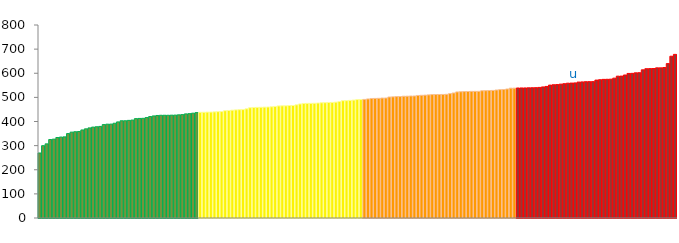
| Category | Top Quartile | 2nd Quartile | 3rd Quartile | Bottom Quartile | Series 4 |
|---|---|---|---|---|---|
|  | 269.4 | 0 | 0 | 0 | 269.4 |
|  | 299.8 | 0 | 0 | 0 | 299.8 |
|  | 307.3 | 0 | 0 | 0 | 307.3 |
|  | 325.2 | 0 | 0 | 0 | 325.2 |
|  | 326.9 | 0 | 0 | 0 | 326.9 |
|  | 333.6 | 0 | 0 | 0 | 333.6 |
|  | 335.5 | 0 | 0 | 0 | 335.5 |
|  | 336.3 | 0 | 0 | 0 | 336.3 |
|  | 350 | 0 | 0 | 0 | 350 |
|  | 355.9 | 0 | 0 | 0 | 355.9 |
|  | 357.6 | 0 | 0 | 0 | 357.6 |
|  | 358.4 | 0 | 0 | 0 | 358.4 |
|  | 364.9 | 0 | 0 | 0 | 364.9 |
|  | 369.6 | 0 | 0 | 0 | 369.6 |
|  | 373.4 | 0 | 0 | 0 | 373.4 |
|  | 376.8 | 0 | 0 | 0 | 376.8 |
|  | 378.2 | 0 | 0 | 0 | 378.2 |
|  | 379.6 | 0 | 0 | 0 | 379.6 |
|  | 387.2 | 0 | 0 | 0 | 387.2 |
|  | 388.9 | 0 | 0 | 0 | 388.9 |
|  | 389.2 | 0 | 0 | 0 | 389.2 |
|  | 392.7 | 0 | 0 | 0 | 392.7 |
|  | 398.3 | 0 | 0 | 0 | 398.3 |
|  | 403 | 0 | 0 | 0 | 403 |
|  | 403.1 | 0 | 0 | 0 | 403.1 |
|  | 404.6 | 0 | 0 | 0 | 404.6 |
|  | 405.9 | 0 | 0 | 0 | 405.9 |
|  | 411.9 | 0 | 0 | 0 | 411.9 |
|  | 412.7 | 0 | 0 | 0 | 412.7 |
|  | 413.2 | 0 | 0 | 0 | 413.2 |
|  | 416.3 | 0 | 0 | 0 | 416.3 |
|  | 420.5 | 0 | 0 | 0 | 420.5 |
|  | 423.1 | 0 | 0 | 0 | 423.1 |
|  | 425 | 0 | 0 | 0 | 425 |
|  | 425.8 | 0 | 0 | 0 | 425.8 |
|  | 425.8 | 0 | 0 | 0 | 425.8 |
|  | 425.8 | 0 | 0 | 0 | 425.8 |
|  | 426.2 | 0 | 0 | 0 | 426.2 |
|  | 426.5 | 0 | 0 | 0 | 426.5 |
|  | 427.6 | 0 | 0 | 0 | 427.6 |
|  | 428.5 | 0 | 0 | 0 | 428.5 |
|  | 431.5 | 0 | 0 | 0 | 431.5 |
|  | 432.5 | 0 | 0 | 0 | 432.5 |
|  | 434.5 | 0 | 0 | 0 | 434.5 |
|  | 436.8 | 0 | 0 | 0 | 436.8 |
|  | 0 | 438.3 | 0 | 0 | 438.3 |
|  | 0 | 438.4 | 0 | 0 | 438.4 |
|  | 0 | 439 | 0 | 0 | 439 |
|  | 0 | 439.2 | 0 | 0 | 439.2 |
|  | 0 | 439.9 | 0 | 0 | 439.9 |
|  | 0 | 440.8 | 0 | 0 | 440.8 |
|  | 0 | 441.1 | 0 | 0 | 441.1 |
|  | 0 | 444.7 | 0 | 0 | 444.7 |
|  | 0 | 445.7 | 0 | 0 | 445.7 |
|  | 0 | 447 | 0 | 0 | 447 |
|  | 0 | 448.1 | 0 | 0 | 448.1 |
|  | 0 | 449 | 0 | 0 | 449 |
|  | 0 | 449.3 | 0 | 0 | 449.3 |
|  | 0 | 452.6 | 0 | 0 | 452.6 |
|  | 0 | 457 | 0 | 0 | 457 |
|  | 0 | 458.2 | 0 | 0 | 458.2 |
|  | 0 | 458.6 | 0 | 0 | 458.6 |
|  | 0 | 459.1 | 0 | 0 | 459.1 |
|  | 0 | 459.6 | 0 | 0 | 459.6 |
|  | 0 | 460.1 | 0 | 0 | 460.1 |
|  | 0 | 461 | 0 | 0 | 461 |
|  | 0 | 462.5 | 0 | 0 | 462.5 |
|  | 0 | 464.6 | 0 | 0 | 464.6 |
|  | 0 | 465 | 0 | 0 | 465 |
|  | 0 | 465 | 0 | 0 | 465 |
|  | 0 | 466.3 | 0 | 0 | 466.3 |
|  | 0 | 466.3 | 0 | 0 | 466.3 |
|  | 0 | 469.1 | 0 | 0 | 469.1 |
|  | 0 | 472.7 | 0 | 0 | 472.7 |
|  | 0 | 474.8 | 0 | 0 | 474.8 |
|  | 0 | 475.2 | 0 | 0 | 475.2 |
|  | 0 | 475.2 | 0 | 0 | 475.2 |
|  | 0 | 475.6 | 0 | 0 | 475.6 |
|  | 0 | 476.6 | 0 | 0 | 476.6 |
|  | 0 | 477.6 | 0 | 0 | 477.6 |
|  | 0 | 477.9 | 0 | 0 | 477.9 |
|  | 0 | 479 | 0 | 0 | 479 |
|  | 0 | 479.1 | 0 | 0 | 479.1 |
|  | 0 | 480.3 | 0 | 0 | 480.3 |
|  | 0 | 482.7 | 0 | 0 | 482.7 |
|  | 0 | 486.2 | 0 | 0 | 486.2 |
|  | 0 | 486.3 | 0 | 0 | 486.3 |
|  | 0 | 487.6 | 0 | 0 | 487.6 |
|  | 0 | 488.8 | 0 | 0 | 488.8 |
|  | 0 | 490.9 | 0 | 0 | 490.9 |
|  | 0 | 490.9 | 0 | 0 | 490.9 |
|  | 0 | 0 | 491.5 | 0 | 491.5 |
|  | 0 | 0 | 493.4 | 0 | 493.4 |
|  | 0 | 0 | 495.4 | 0 | 495.4 |
|  | 0 | 0 | 495.7 | 0 | 495.7 |
|  | 0 | 0 | 496.1 | 0 | 496.1 |
|  | 0 | 0 | 497.2 | 0 | 497.2 |
|  | 0 | 0 | 497.3 | 0 | 497.3 |
|  | 0 | 0 | 501.5 | 0 | 501.5 |
|  | 0 | 0 | 502.2 | 0 | 502.2 |
|  | 0 | 0 | 503.3 | 0 | 503.3 |
|  | 0 | 0 | 503.4 | 0 | 503.4 |
|  | 0 | 0 | 504.7 | 0 | 504.7 |
|  | 0 | 0 | 504.9 | 0 | 504.9 |
|  | 0 | 0 | 505.6 | 0 | 505.6 |
|  | 0 | 0 | 505.7 | 0 | 505.7 |
|  | 0 | 0 | 507.9 | 0 | 507.9 |
|  | 0 | 0 | 508.6 | 0 | 508.6 |
|  | 0 | 0 | 509.3 | 0 | 509.3 |
|  | 0 | 0 | 510.3 | 0 | 510.3 |
|  | 0 | 0 | 511.5 | 0 | 511.5 |
|  | 0 | 0 | 511.8 | 0 | 511.8 |
|  | 0 | 0 | 511.9 | 0 | 511.9 |
|  | 0 | 0 | 512.1 | 0 | 512.1 |
|  | 0 | 0 | 512.7 | 0 | 512.7 |
|  | 0 | 0 | 515.5 | 0 | 515.5 |
|  | 0 | 0 | 518.2 | 0 | 518.2 |
|  | 0 | 0 | 522.5 | 0 | 522.5 |
|  | 0 | 0 | 523.3 | 0 | 523.3 |
|  | 0 | 0 | 524 | 0 | 524 |
|  | 0 | 0 | 524.3 | 0 | 524.3 |
|  | 0 | 0 | 525 | 0 | 525 |
|  | 0 | 0 | 525.1 | 0 | 525.1 |
|  | 0 | 0 | 525.1 | 0 | 525.1 |
|  | 0 | 0 | 527.4 | 0 | 527.4 |
|  | 0 | 0 | 527.7 | 0 | 527.7 |
|  | 0 | 0 | 528.4 | 0 | 528.4 |
|  | 0 | 0 | 528.7 | 0 | 528.7 |
|  | 0 | 0 | 530.5 | 0 | 530.5 |
|  | 0 | 0 | 532.1 | 0 | 532.1 |
|  | 0 | 0 | 532.6 | 0 | 532.6 |
|  | 0 | 0 | 534.7 | 0 | 534.7 |
|  | 0 | 0 | 538.2 | 0 | 538.2 |
|  | 0 | 0 | 538.3 | 0 | 538.3 |
|  | 0 | 0 | 0 | 538.8 | 538.8 |
|  | 0 | 0 | 0 | 539 | 539 |
|  | 0 | 0 | 0 | 539.2 | 539.2 |
|  | 0 | 0 | 0 | 539.6 | 539.6 |
|  | 0 | 0 | 0 | 539.9 | 539.9 |
|  | 0 | 0 | 0 | 540.2 | 540.2 |
|  | 0 | 0 | 0 | 541.3 | 541.3 |
|  | 0 | 0 | 0 | 543.2 | 543.2 |
|  | 0 | 0 | 0 | 545.3 | 545.3 |
|  | 0 | 0 | 0 | 550.8 | 550.8 |
|  | 0 | 0 | 0 | 552.3 | 552.3 |
|  | 0 | 0 | 0 | 553.1 | 553.1 |
|  | 0 | 0 | 0 | 554.9 | 554.9 |
|  | 0 | 0 | 0 | 556.8 | 556.8 |
|  | 0 | 0 | 0 | 558.8 | 558.8 |
|  | 0 | 0 | 0 | 559.2 | 559.2 |
| u | 0 | 0 | 0 | 560.1 | 560.1 |